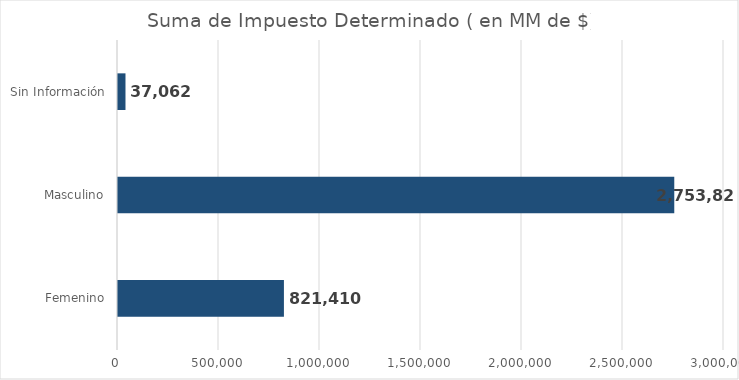
| Category | Series 0 |
|---|---|
| Femenino | 821409.9 |
| Masculino | 2753823.4 |
| Sin Información | 37061.6 |